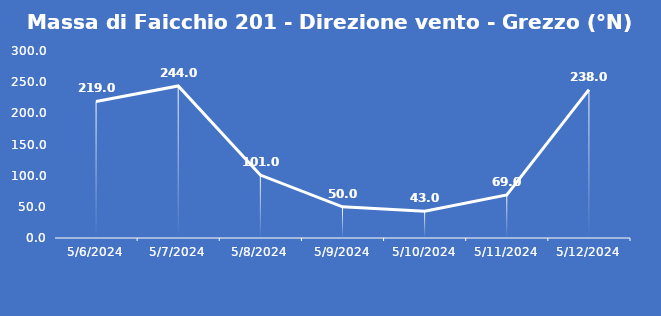
| Category | Massa di Faicchio 201 - Direzione vento - Grezzo (°N) |
|---|---|
| 5/6/24 | 219 |
| 5/7/24 | 244 |
| 5/8/24 | 101 |
| 5/9/24 | 50 |
| 5/10/24 | 43 |
| 5/11/24 | 69 |
| 5/12/24 | 238 |